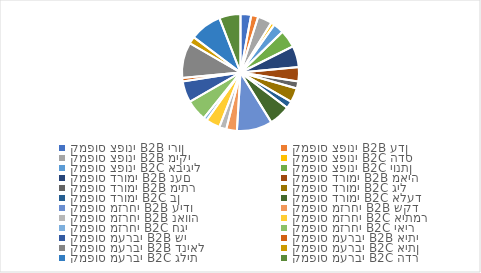
| Category | מכירות |
|---|---|
| 0 | 300 |
| 1 | 200 |
| 2 | 400 |
| 3 | 100 |
| 4 | 300 |
| 5 | 500 |
| 6 | 600 |
| 7 | 400 |
| 8 | 200 |
| 9 | 400 |
| 10 | 200 |
| 11 | 600 |
| 12 | 1000 |
| 13 | 300 |
| 14 | 200 |
| 15 | 400 |
| 16 | 100 |
| 17 | 600 |
| 18 | 600 |
| 19 | 100 |
| 20 | 1000 |
| 21 | 200 |
| 22 | 900 |
| 23 | 600 |